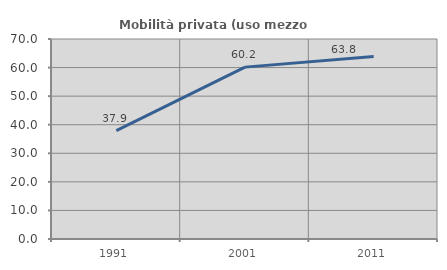
| Category | Mobilità privata (uso mezzo privato) |
|---|---|
| 1991.0 | 37.908 |
| 2001.0 | 60.156 |
| 2011.0 | 63.842 |